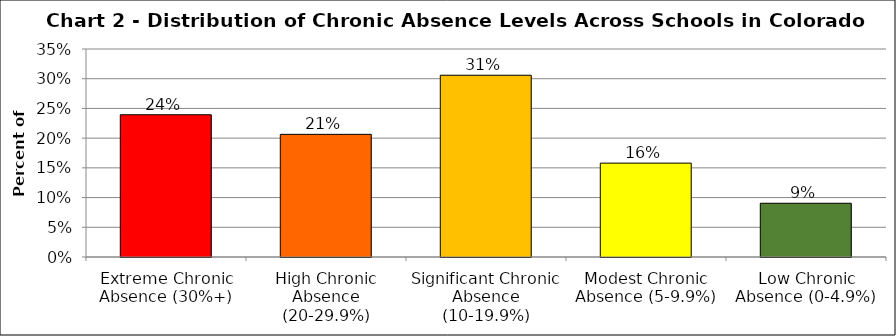
| Category | Series 1 |
|---|---|
| Extreme Chronic Absence (30%+) | 0.239 |
| High Chronic Absence (20-29.9%) | 0.206 |
| Significant Chronic Absence (10-19.9%) | 0.306 |
| Modest Chronic Absence (5-9.9%) | 0.158 |
| Low Chronic Absence (0-4.9%) | 0.09 |